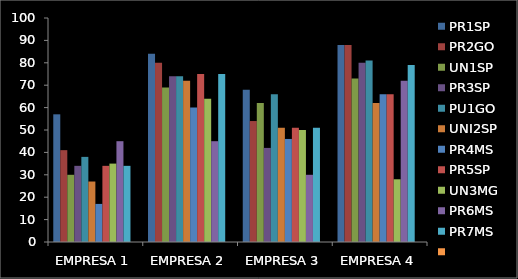
| Category | PR1SP | PR2GO | UN1SP | PR3SP | PU1GO | UNI2SP | PR4MS | PR5SP | UN3MG | PR6MS | PR7MS | Series 11 |
|---|---|---|---|---|---|---|---|---|---|---|---|---|
| EMPRESA 1 | 57 | 41 | 30 | 34 | 38 | 27 | 17 | 34 | 35 | 45 | 34 |  |
| EMPRESA 2 | 84 | 80 | 69 | 74 | 74 | 72 | 60 | 75 | 64 | 45 | 75 |  |
| EMPRESA 3 | 68 | 54 | 62 | 42 | 66 | 51 | 46 | 51 | 50 | 30 | 51 |  |
| EMPRESA 4 | 88 | 88 | 73 | 80 | 81 | 62 | 66 | 66 | 28 | 72 | 79 |  |